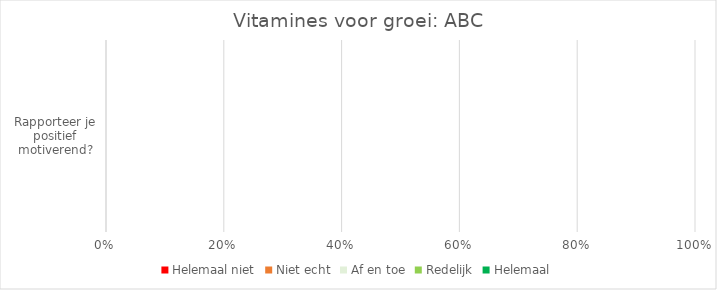
| Category | Helemaal niet | Niet echt | Af en toe | Redelijk | Helemaal |
|---|---|---|---|---|---|
| Rapporteer je positief motiverend? | 0 | 0 | 0 | 0 | 0 |